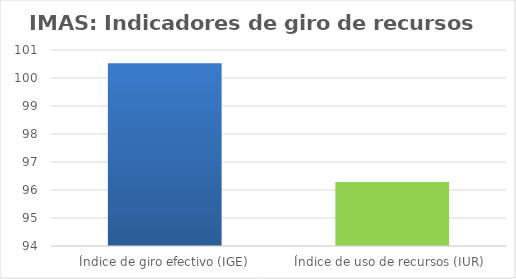
| Category | Series 0 |
|---|---|
| Índice de giro efectivo (IGE) | 100.524 |
| Índice de uso de recursos (IUR)  | 96.284 |